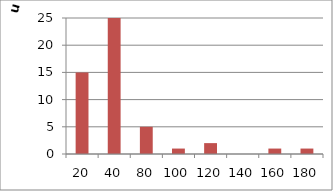
| Category | Series 1 |
|---|---|
| 20.0 | 15 |
| 40.0 | 25 |
| 80.0 | 5 |
| 100.0 | 1 |
| 120.0 | 2 |
| 140.0 | 0 |
| 160.0 | 1 |
| 180.0 | 1 |